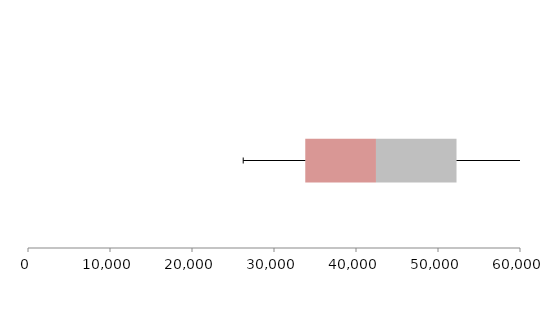
| Category | Series 1 | Series 2 | Series 3 |
|---|---|---|---|
| 0 | 33813.03 | 8621.748 | 9822.336 |